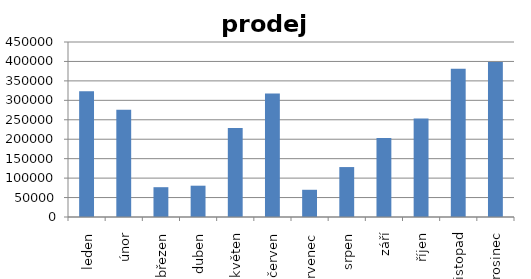
| Category | Series 0 |
|---|---|
| leden | 323544 |
| únor | 275872 |
| březen | 76636 |
| duben | 80496 |
| květen | 229009 |
| červen | 317502 |
| červenec | 69998 |
| srpen | 128402 |
| září | 203148 |
| říjen | 253422 |
| listopad | 381140 |
| prosinec | 398334 |